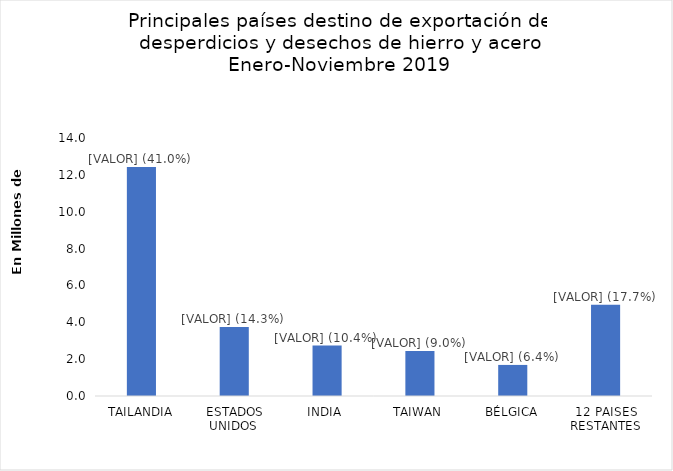
| Category | Series 0 |
|---|---|
| TAILANDIA | 12431854 |
| ESTADOS UNIDOS  | 3746450 |
| INDIA  | 2736340 |
| TAIWAN | 2437600 |
| BÉLGICA | 1686200 |
| 12 PAISES RESTANTES | 4958130 |